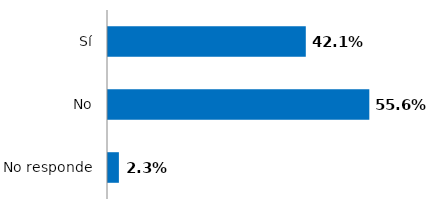
| Category | Series 0 |
|---|---|
| Sí | 0.421 |
| No | 0.556 |
| No responde | 0.023 |